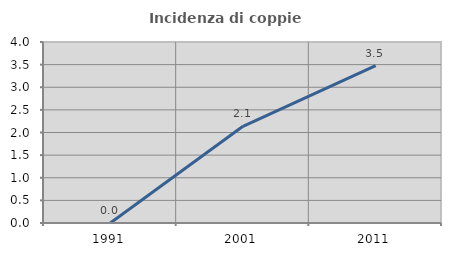
| Category | Incidenza di coppie miste |
|---|---|
| 1991.0 | 0 |
| 2001.0 | 2.137 |
| 2011.0 | 3.478 |